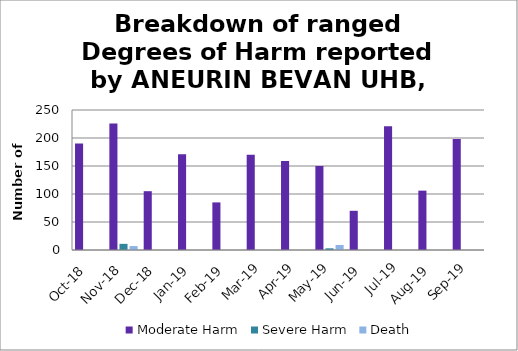
| Category | Moderate Harm | Severe Harm | Death |
|---|---|---|---|
| Oct-18 | 190 | 0 | 0 |
| Nov-18 | 226 | 11 | 7 |
| Dec-18 | 105 | 0 | 0 |
| Jan-19 | 171 | 0 | 0 |
| Feb-19 | 85 | 0 | 0 |
| Mar-19 | 170 | 0 | 0 |
| Apr-19 | 159 | 0 | 0 |
| May-19 | 150 | 3 | 9 |
| Jun-19 | 70 | 0 | 0 |
| Jul-19 | 221 | 0 | 0 |
| Aug-19 | 106 | 0 | 0 |
| Sep-19 | 198 | 0 | 0 |